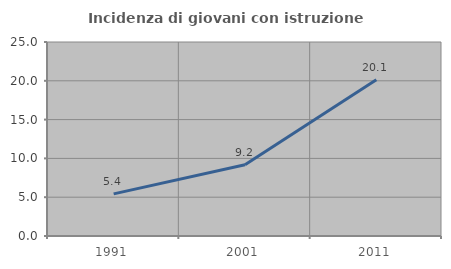
| Category | Incidenza di giovani con istruzione universitaria |
|---|---|
| 1991.0 | 5.433 |
| 2001.0 | 9.186 |
| 2011.0 | 20.128 |